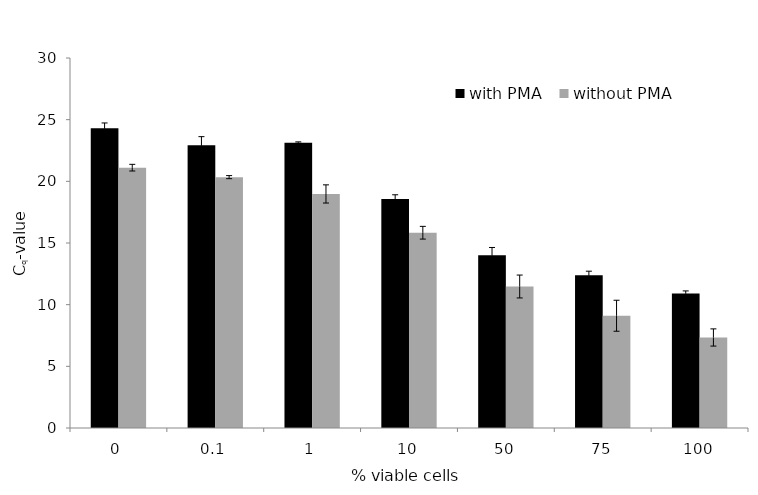
| Category | with PMA | without PMA |
|---|---|---|
| 0.0 | 24.295 | 21.108 |
| 0.1 | 22.925 | 20.341 |
| 1.0 | 23.136 | 18.978 |
| 10.0 | 18.56 | 15.833 |
| 50.0 | 14.007 | 11.473 |
| 75.0 | 12.382 | 9.102 |
| 100.0 | 10.91 | 7.339 |